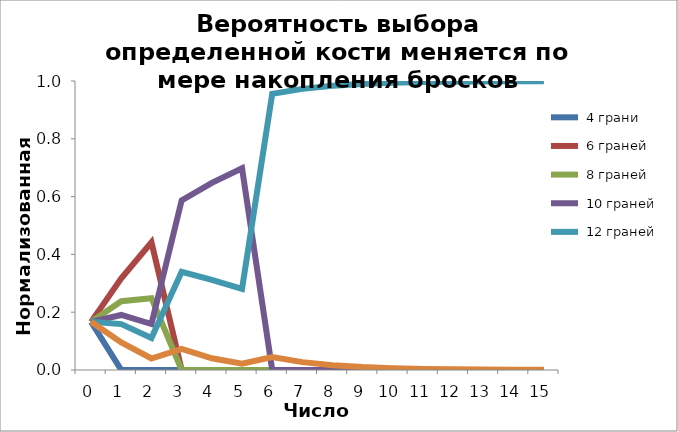
| Category |  4 грани |  6 граней |  8 граней |  10 граней |  12 граней |  20 граней |
|---|---|---|---|---|---|---|
| 0.0 | 0.167 | 0.167 | 0.167 | 0.167 | 0.167 | 0.167 |
| 1.0 | 0 | 0.317 | 0.238 | 0.19 | 0.159 | 0.095 |
| 2.0 | 0 | 0.442 | 0.249 | 0.159 | 0.11 | 0.04 |
| 3.0 | 0 | 0 | 0 | 0.587 | 0.34 | 0.073 |
| 4.0 | 0 | 0 | 0 | 0.647 | 0.312 | 0.04 |
| 5.0 | 0 | 0 | 0 | 0.698 | 0.28 | 0.022 |
| 6.0 | 0 | 0 | 0 | 0 | 0.955 | 0.045 |
| 7.0 | 0 | 0 | 0 | 0 | 0.973 | 0.027 |
| 8.0 | 0 | 0 | 0 | 0 | 0.983 | 0.017 |
| 9.0 | 0 | 0 | 0 | 0 | 0.99 | 0.01 |
| 10.0 | 0 | 0 | 0 | 0 | 0.994 | 0.006 |
| 11.0 | 0 | 0 | 0 | 0 | 0.996 | 0.004 |
| 12.0 | 0 | 0 | 0 | 0 | 0.998 | 0.002 |
| 13.0 | 0 | 0 | 0 | 0 | 0.999 | 0.001 |
| 14.0 | 0 | 0 | 0 | 0 | 0.999 | 0.001 |
| 15.0 | 0 | 0 | 0 | 0 | 1 | 0 |